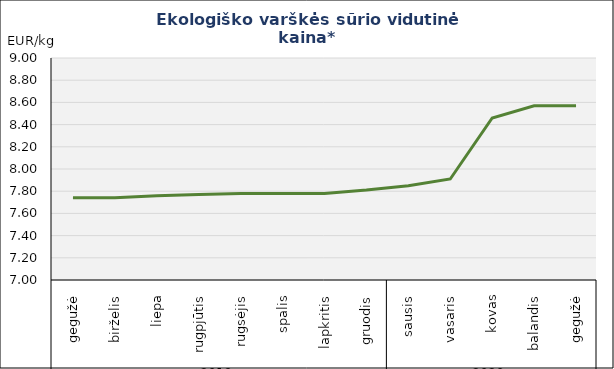
| Category | Varškės sūris |
|---|---|
| 0 | 7.74 |
| 1 | 7.74 |
| 2 | 7.76 |
| 3 | 7.77 |
| 4 | 7.78 |
| 5 | 7.78 |
| 6 | 7.78 |
| 7 | 7.81 |
| 8 | 7.85 |
| 9 | 7.91 |
| 10 | 8.46 |
| 11 | 8.57 |
| 12 | 8.57 |